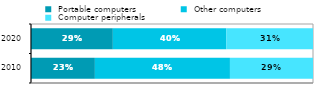
| Category |  Portable computers |  Other computers |  Computer peripherals |
|---|---|---|---|
| 2010.0 | 0.227 | 0.479 | 0.295 |
| 2020.0 | 0.29 | 0.402 | 0.308 |